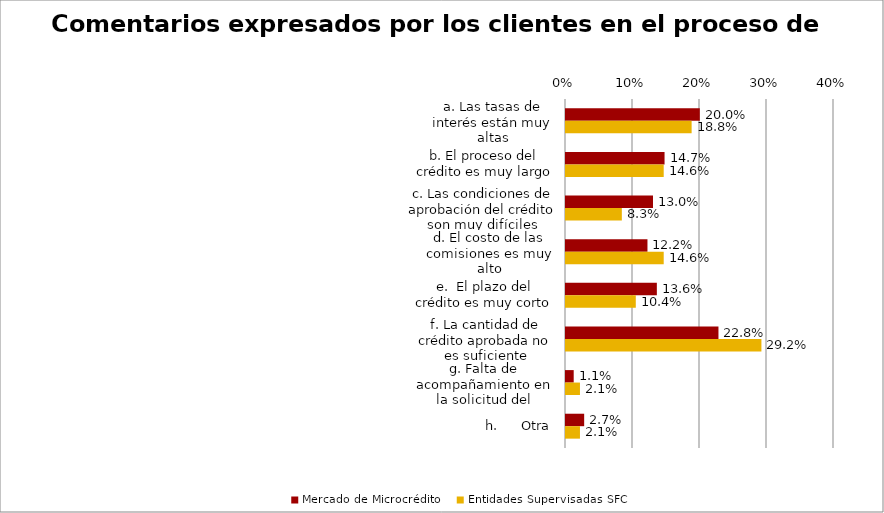
| Category | Mercado de Microcrédito | Entidades Supervisadas SFC |
|---|---|---|
| a. Las tasas de interés están muy altas | 0.2 | 0.188 |
| b. El proceso del crédito es muy largo | 0.147 | 0.146 |
| c. Las condiciones de aprobación del crédito son muy difíciles | 0.13 | 0.083 |
| d. El costo de las comisiones es muy alto | 0.122 | 0.146 |
| e.  El plazo del crédito es muy corto | 0.136 | 0.104 |
| f. La cantidad de crédito aprobada no es suficiente | 0.228 | 0.292 |
| g. Falta de acompañamiento en la solicitud del crédito | 0.011 | 0.021 |
| h.      Otra | 0.027 | 0.021 |